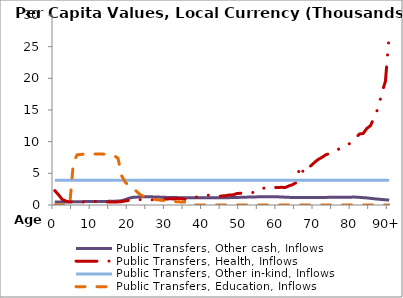
| Category | Public Transfers, Other cash, Inflows | Public Transfers, Health, Inflows | Public Transfers, Other in-kind, Inflows | Public Transfers, Education, Inflows |
|---|---|---|---|---|
| 0 | 486.064 | 2268.92 | 3910.356 | 0 |
|  | 486.651 | 1600.625 | 3910.356 | 0 |
| 2 | 487.24 | 867.423 | 3910.356 | 0 |
| 3 | 488.785 | 616.796 | 3910.356 | 0 |
| 4 | 492.801 | 500.933 | 3910.356 | 0 |
| 5 | 499.91 | 472.789 | 3910.356 | 6788.315 |
| 6 | 510.424 | 439.196 | 3910.356 | 7918.271 |
| 7 | 522.888 | 444.878 | 3910.356 | 7990.579 |
| 8 | 535.696 | 504.626 | 3910.356 | 8011.413 |
| 9 | 548.421 | 525.573 | 3910.356 | 8027.345 |
| 10 | 557.957 | 536.705 | 3910.356 | 8037.149 |
| 11 | 561.599 | 559.224 | 3910.356 | 8046.954 |
| 12 | 562.212 | 545.602 | 3910.356 | 8039.601 |
| 13 | 561.018 | 493.699 | 3910.356 | 8033.473 |
| 14 | 552.594 | 474.885 | 3910.356 | 8021.217 |
| 15 | 612.273 | 475.166 | 3910.356 | 7959.94 |
| 16 | 598.045 | 470.001 | 3910.356 | 7771.206 |
| 17 | 623.651 | 492.292 | 3910.356 | 7382.707 |
| 18 | 679.61 | 537.057 | 3910.356 | 4597.034 |
| 19 | 859.932 | 646.394 | 3910.356 | 3563.896 |
| 20 | 1079.876 | 726.894 | 3910.356 | 3061.421 |
| 21 | 1208.11 | 806.939 | 3910.356 | 2672.922 |
| 22 | 1242.841 | 830.842 | 3910.356 | 2145.031 |
| 23 | 1286.731 | 847.496 | 3910.356 | 1626.303 |
| 24 | 1296.01 | 792.916 | 3910.356 | 1344.427 |
| 25 | 1304.837 | 754.288 | 3910.356 | 1123.828 |
| 26 | 1290.812 | 806.373 | 3910.356 | 985.341 |
| 27 | 1267.086 | 835.849 | 3910.356 | 876.268 |
| 28 | 1248.449 | 784.492 | 3910.356 | 800.283 |
| 29 | 1228.482 | 843.534 | 3910.356 | 719.397 |
| 30 | 1204.98 | 947.947 | 3910.356 | 645.864 |
| 31 | 1183.716 | 979.901 | 3910.356 | 601.47 |
| 32 | 1165.101 | 959.694 | 3910.356 | 563.752 |
| 33 | 1164.097 | 1047.906 | 3910.356 | 509.828 |
| 34 | 1155.307 | 1020.709 | 3910.356 | 485.062 |
| 35 | 1157.202 | 895.814 | 3910.356 | 451.002 |
| 36 | 1155.908 | 849.649 | 3910.356 | 0 |
| 37 | 1161.46 | 956.531 | 3910.356 | 0 |
| 38 | 1155.564 | 1242.475 | 3910.356 | 0 |
| 39 | 1159.428 | 1330.668 | 3910.356 | 0 |
| 40 | 1157.962 | 1417.921 | 3910.356 | 0 |
| 41 | 1151.626 | 1558.834 | 3910.356 | 0 |
| 42 | 1147.104 | 1498.813 | 3910.356 | 0 |
| 43 | 1144.27 | 1351.507 | 3910.356 | 0 |
| 44 | 1144.351 | 1353.473 | 3910.356 | 0 |
| 45 | 1142.267 | 1430.825 | 3910.356 | 0 |
| 46 | 1152.704 | 1461.665 | 3910.356 | 0 |
| 47 | 1164.043 | 1589.285 | 3910.356 | 0 |
| 48 | 1183.29 | 1600.662 | 3910.356 | 0 |
| 49 | 1194.591 | 1799.977 | 3910.356 | 0 |
| 50 | 1207.428 | 1855.136 | 3910.356 | 0 |
| 51 | 1215.409 | 1827.806 | 3910.356 | 0 |
| 52 | 1252.426 | 1824.257 | 3910.356 | 0 |
| 53 | 1264.325 | 1928.837 | 3910.356 | 0 |
| 54 | 1276.088 | 2109.049 | 3910.356 | 0 |
| 55 | 1293.782 | 2249.079 | 3910.356 | 0 |
| 56 | 1309.972 | 2590.388 | 3910.356 | 0 |
| 57 | 1305.016 | 2836.979 | 3910.356 | 0 |
| 58 | 1303.961 | 2825.424 | 3910.356 | 0 |
| 59 | 1302.258 | 2776.416 | 3910.356 | 0 |
| 60 | 1290.323 | 2743.661 | 3910.356 | 0 |
| 61 | 1267.285 | 2798.899 | 3910.356 | 0 |
| 62 | 1236.634 | 2747.906 | 3910.356 | 0 |
| 63 | 1209.151 | 3020.375 | 3910.356 | 0 |
| 64 | 1184.916 | 3202.281 | 3910.356 | 0 |
| 65 | 1167.18 | 3559.594 | 3910.356 | 0 |
| 66 | 1164.408 | 6191.571 | 3910.356 | 0 |
| 67 | 1168.319 | 5068.001 | 3910.356 | 0 |
| 68 | 1165.871 | 5942.263 | 3910.356 | 0 |
| 69 | 1165.518 | 6217.489 | 3910.356 | 0 |
| 70 | 1176.737 | 6778.21 | 3910.356 | 0 |
| 71 | 1176.565 | 7234.781 | 3910.356 | 0 |
| 72 | 1182.077 | 7551.79 | 3910.356 | 0 |
| 73 | 1197.939 | 7950.779 | 3910.356 | 0 |
| 74 | 1215.243 | 8108.242 | 3910.356 | 0 |
| 75 | 1225.442 | 8379.498 | 3910.356 | 0 |
| 76 | 1236.168 | 8687.271 | 3910.356 | 0 |
| 77 | 1236.865 | 9025.358 | 3910.356 | 0 |
| 78 | 1232.952 | 9297.802 | 3910.356 | 0 |
| 79 | 1209.21 | 9558.223 | 3910.356 | 0 |
| 80 | 1243.811 | 9985.679 | 3910.356 | 0 |
| 81 | 1243.363 | 10621.45 | 3910.356 | 0 |
| 82 | 1204.877 | 11212.74 | 3910.356 | 0 |
| 83 | 1158.438 | 11290.67 | 3910.356 | 0 |
| 84 | 1121.492 | 12087.76 | 3910.356 | 0 |
| 85 | 1049.648 | 12538.56 | 3910.356 | 0 |
| 86 | 979.544 | 13891.83 | 3910.356 | 0 |
| 87 | 924.976 | 15259.85 | 3910.356 | 0 |
| 88 | 873.464 | 17594.95 | 3910.356 | 0 |
| 89 | 821.507 | 19546.05 | 3910.356 | 0 |
| 90+ | 776.373 | 26821.14 | 3910.356 | 0 |